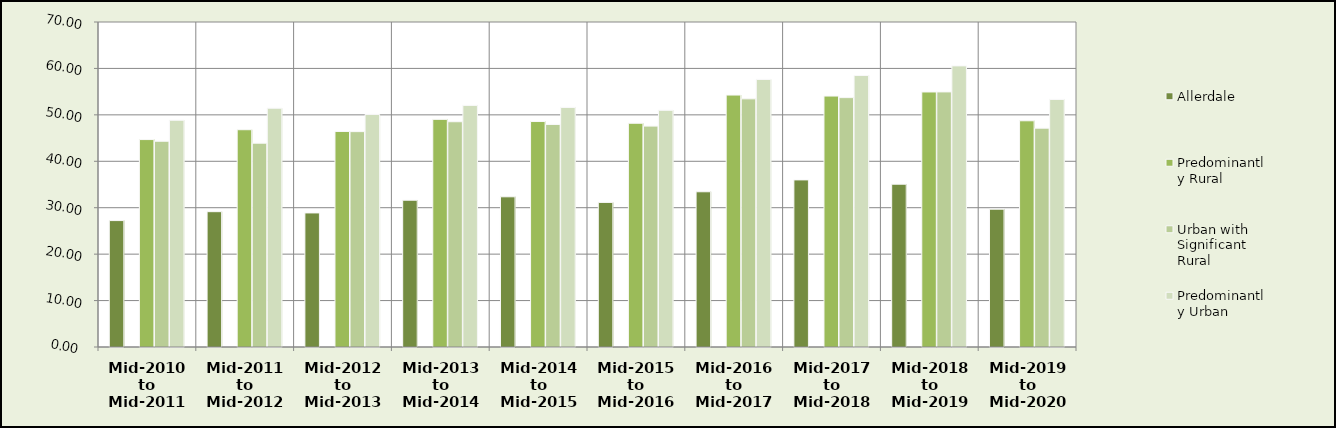
| Category | Allerdale | Series 1 | Predominantly Rural | Urban with Significant Rural | Predominantly Urban |
|---|---|---|---|---|---|
| Mid-2010 to Mid-2011 | 27.228 |  | 44.676 | 44.313 | 48.836 |
| Mid-2011 to Mid-2012 | 29.147 |  | 46.799 | 43.895 | 51.427 |
| Mid-2012 to Mid-2013 | 28.877 |  | 46.424 | 46.388 | 50.086 |
| Mid-2013 to Mid-2014 | 31.616 |  | 49.029 | 48.516 | 52.034 |
| Mid-2014 to Mid-2015 | 32.349 |  | 48.565 | 47.93 | 51.59 |
| Mid-2015 to Mid-2016 | 31.143 |  | 48.191 | 47.573 | 50.978 |
| Mid-2016 to Mid-2017 | 33.432 |  | 54.266 | 53.449 | 57.621 |
| Mid-2017 to Mid-2018 | 35.99 |  | 54.048 | 53.714 | 58.473 |
| Mid-2018 to Mid-2019 | 35.065 |  | 54.929 | 54.943 | 60.546 |
| Mid-2019 to Mid-2020 | 29.684 |  | 48.722 | 47.131 | 53.313 |